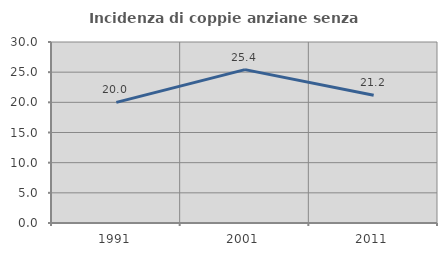
| Category | Incidenza di coppie anziane senza figli  |
|---|---|
| 1991.0 | 20 |
| 2001.0 | 25.424 |
| 2011.0 | 21.176 |